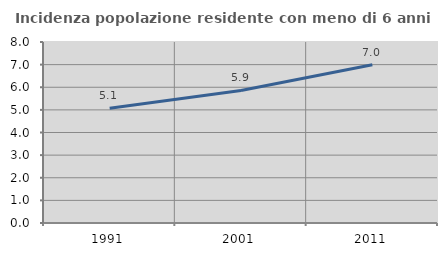
| Category | Incidenza popolazione residente con meno di 6 anni |
|---|---|
| 1991.0 | 5.069 |
| 2001.0 | 5.858 |
| 2011.0 | 6.998 |